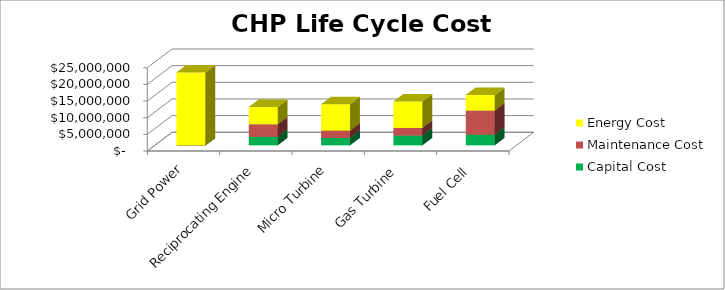
| Category | Capital Cost | Maintenance Cost | Energy Cost |
|---|---|---|---|
| Grid Power | 0 | 0 | 21886889.971 |
| Reciprocating Engine | 2553300 | 3791672.488 | 5163931.045 |
| Micro Turbine | 2250000 | 2166669.993 | 7958516.239 |
| Gas Turbine | 2952900 | 2275003.493 | 7921190.405 |
| Fuel Cell | 3220000 | 7222233.31 | 4672784.952 |